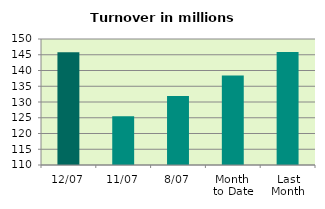
| Category | Series 0 |
|---|---|
| 12/07 | 145.796 |
| 11/07 | 125.467 |
| 8/07 | 131.871 |
| Month 
to Date | 138.421 |
| Last
Month | 145.879 |